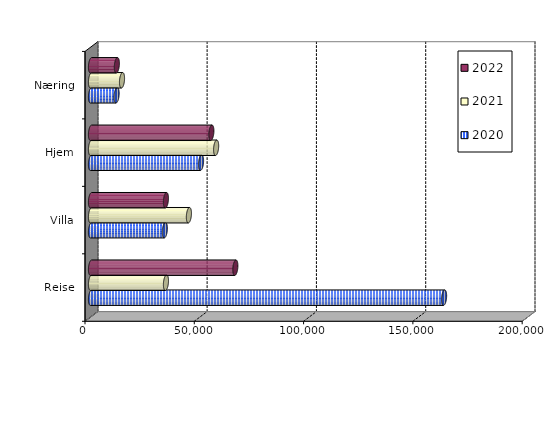
| Category | 2020 | 2021 | 2022 |
|---|---|---|---|
| Reise | 161525 | 34290.494 | 66033.365 |
| Villa | 33779.379 | 44786.945 | 34271.79 |
| Hjem | 50338.84 | 57244.673 | 55060.822 |
| Næring | 11707.421 | 14184.868 | 11825.086 |